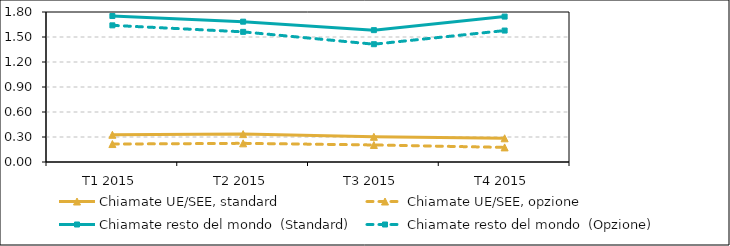
| Category | Chiamate UE/SEE, standard | Chiamate UE/SEE, opzione | Chiamate resto del mondo  (Standard) | Chiamate resto del mondo  (Opzione) |
|---|---|---|---|---|
| T1 2015 | 0.326 | 0.215 | 1.752 | 1.64 |
| T2 2015 | 0.335 | 0.224 | 1.684 | 1.562 |
| T3 2015 | 0.303 | 0.204 | 1.582 | 1.413 |
| T4 2015 | 0.284 | 0.175 | 1.745 | 1.577 |